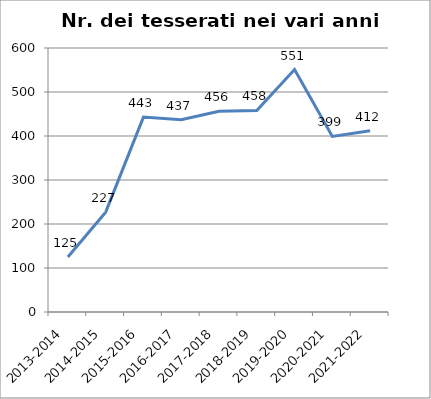
| Category | Nr. Tesserati |
|---|---|
| 2013-2014 | 125 |
| 2014-2015 | 227 |
| 2015-2016 | 443 |
| 2016-2017 | 437 |
| 2017-2018 | 456 |
| 2018-2019 | 458 |
| 2019-2020 | 551 |
| 2020-2021 | 399 |
| 2021-2022 | 412 |